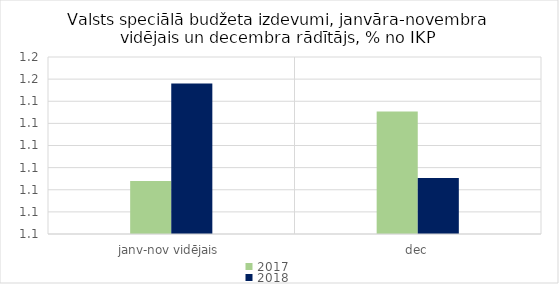
| Category | 2017 | 2018 |
|---|---|---|
| janv-nov vidējais | 1.104 | 1.148 |
| dec | 1.135 | 1.105 |